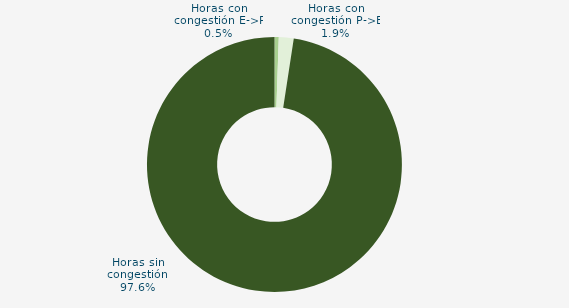
| Category | Horas con congestión E->P |
|---|---|
| Horas con congestión E->P | 0.537 |
| Horas con congestión P->E | 1.879 |
| Horas sin congestión | 97.584 |